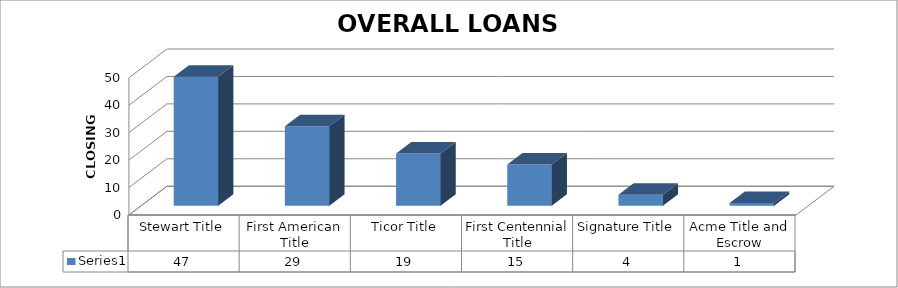
| Category | Series 0 |
|---|---|
| Stewart Title | 47 |
| First American Title | 29 |
| Ticor Title | 19 |
| First Centennial Title | 15 |
| Signature Title | 4 |
| Acme Title and Escrow | 1 |